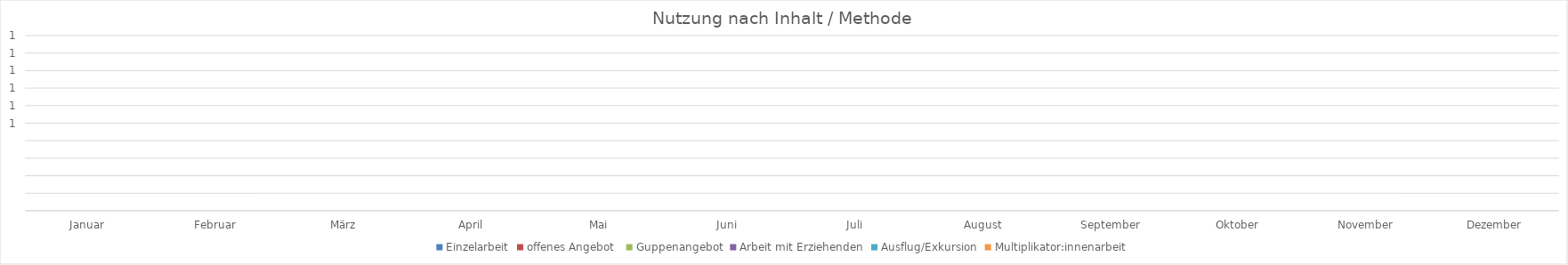
| Category | Einzelarbeit | offenes Angebot  | Guppenangebot | Arbeit mit Erziehenden | Ausflug/Exkursion | Multiplikator:innenarbeit |
|---|---|---|---|---|---|---|
| Januar | 0 | 0 | 0 | 0 | 0 | 0 |
| Februar | 0 | 0 | 0 | 0 | 0 | 0 |
| März | 0 | 0 | 0 | 0 | 0 | 0 |
| April | 0 | 0 | 0 | 0 | 0 | 0 |
| Mai | 0 | 0 | 0 | 0 | 0 | 0 |
| Juni | 0 | 0 | 0 | 0 | 0 | 0 |
| Juli | 0 | 0 | 0 | 0 | 0 | 0 |
| August | 0 | 0 | 0 | 0 | 0 | 0 |
| September | 0 | 0 | 0 | 0 | 0 | 0 |
| Oktober | 0 | 0 | 0 | 0 | 0 | 0 |
| November | 0 | 0 | 0 | 0 | 0 | 0 |
| Dezember | 0 | 0 | 0 | 0 | 0 | 0 |